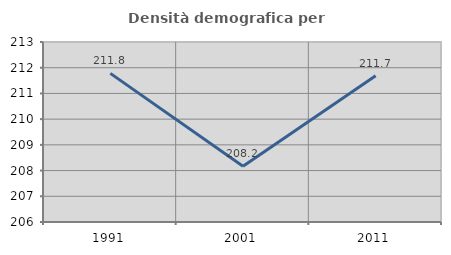
| Category | Densità demografica |
|---|---|
| 1991.0 | 211.78 |
| 2001.0 | 208.167 |
| 2011.0 | 211.687 |